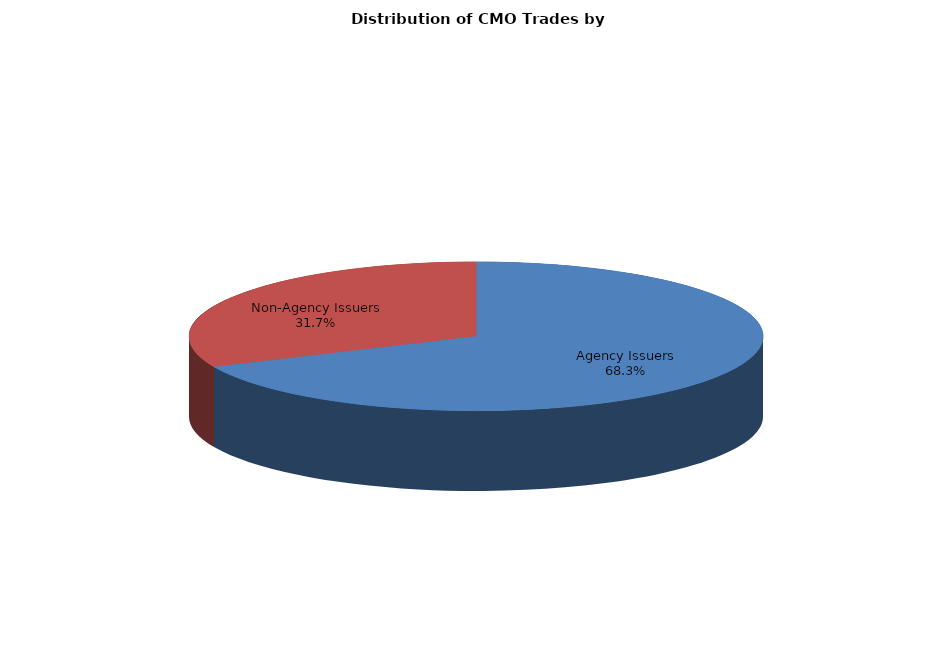
| Category | Series 0 |
|---|---|
| Agency Issuers | 1144 |
| Non-Agency Issuers | 531 |